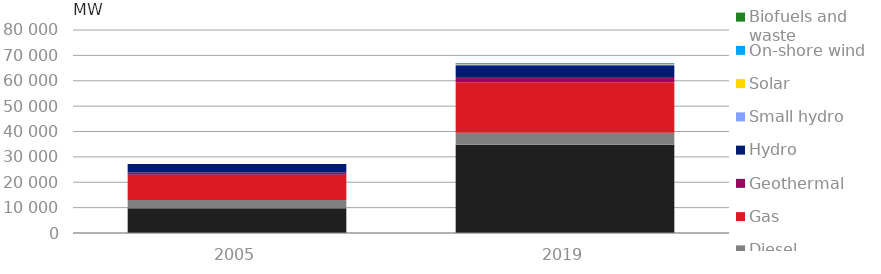
| Category | Coal | Diesel  | Gas | Geothermal 
 | Hydro  | Small hydro | Solar  | On-shore wind  | Biofuels and waste |
|---|---|---|---|---|---|---|---|---|---|
| 2005.0 | 9750 | 3208.078 | 10022.32 | 850 | 3407.46 | 3.475 | 0 | 0 | 0 |
| 2019.0 | 34737.17 | 4779.683 | 19860.014 | 2130.7 | 4620.52 | 410.629 | 105.033 | 153.83 | 204.82 |